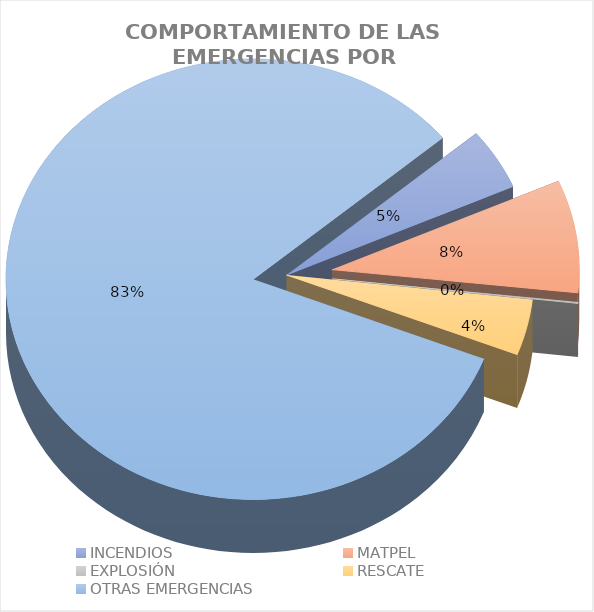
| Category | Series 0 |
|---|---|
| INCENDIOS | 0.045 |
| MATPEL | 0.083 |
| EXPLOSIÓN | 0.001 |
| RESCATE | 0.041 |
| OTRAS EMERGENCIAS | 0.83 |